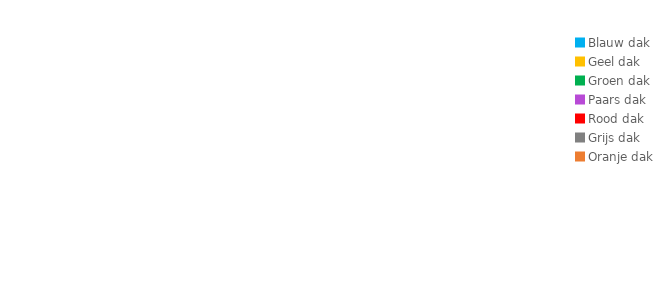
| Category | Series 0 |
|---|---|
| Blauw dak | 0 |
| Geel dak | 0 |
| Groen dak | 0 |
| Paars dak | 0 |
| Rood dak | 0 |
| Grijs dak | 0 |
| Oranje dak | 0 |